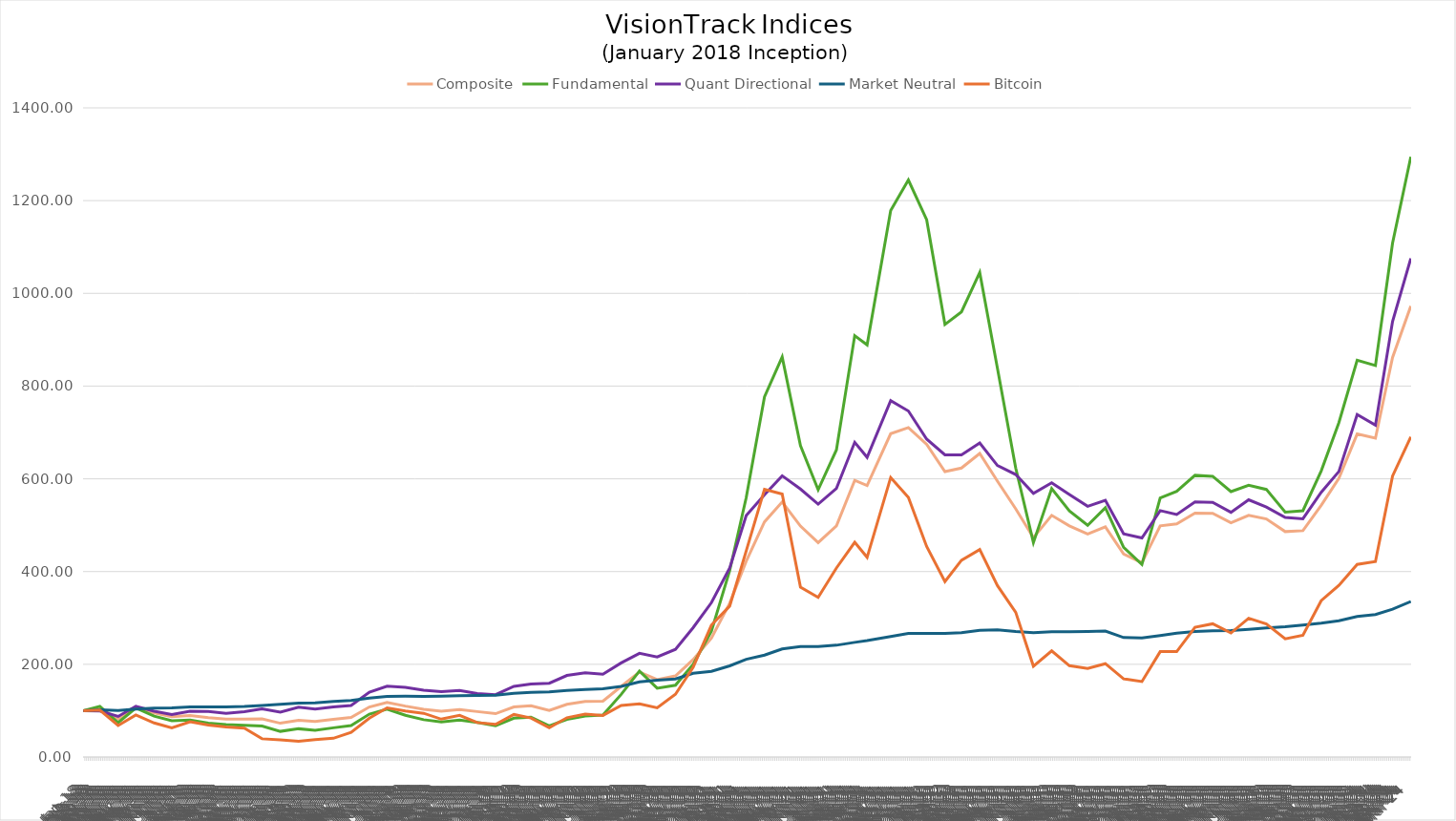
| Category | Composite | Fundamental | Quant Directional | Market Neutral | Bitcoin |
|---|---|---|---|---|---|
| 2018-01-31 | 100 | 100 | 100 | 100 | 100 |
| 2018-02-28 | 105.626 | 109.496 | 99.404 | 101.803 | 101.373 |
| 2018-03-31 | 81.785 | 74.086 | 87.509 | 100.609 | 68.018 |
| 2018-04-30 | 108.332 | 105.821 | 109.653 | 103.51 | 90.833 |
| 2018-05-31 | 95.101 | 88.265 | 98.96 | 105.404 | 73.54 |
| 2018-06-30 | 86.877 | 78.319 | 91.551 | 105.812 | 62.746 |
| 2018-07-31 | 89.714 | 79.552 | 98.729 | 107.935 | 75.884 |
| 2018-08-31 | 84.928 | 73.131 | 98.063 | 108.169 | 68.889 |
| 2018-09-30 | 81.868 | 70.118 | 94.287 | 108.338 | 64.897 |
| 2018-10-31 | 81.8 | 68.597 | 97.833 | 109.05 | 62.19 |
| 2018-11-30 | 82.432 | 66.686 | 104.114 | 111.09 | 39.351 |
| 2018-12-31 | 72.907 | 55.375 | 96.894 | 113.947 | 36.927 |
| 2019-01-31 | 79.299 | 60.976 | 107.526 | 116.381 | 33.875 |
| 2019-02-28 | 76.494 | 57.89 | 103.653 | 116.704 | 37.68 |
| 2019-03-31 | 81.369 | 63.058 | 108.098 | 120.095 | 40.523 |
| 2019-04-30 | 85.477 | 67.87 | 111.256 | 121.926 | 52.97 |
| 2019-05-31 | 107.968 | 92.481 | 139.715 | 127.266 | 83.986 |
| 2019-06-30 | 117.915 | 103.487 | 152.786 | 130.868 | 105.905 |
| 2019-07-31 | 109.882 | 90.025 | 150.275 | 131.131 | 99.144 |
| 2019-08-31 | 102.769 | 80.514 | 143.918 | 130.604 | 94.351 |
| 2019-09-30 | 99.038 | 75.442 | 140.925 | 131.029 | 81.736 |
| 2019-10-31 | 102.615 | 79.903 | 143.444 | 132.168 | 90.068 |
| 2019-11-30 | 98.039 | 74.56 | 136.908 | 132.583 | 74.384 |
| 2019-12-31 | 93.49 | 67.778 | 134.575 | 133.228 | 70.559 |
| 2020-01-31 | 107.88 | 83.694 | 152.355 | 137.246 | 91.805 |
| 2020-02-29 | 110.634 | 85.799 | 157.255 | 139.612 | 84.201 |
| 2020-03-31 | 100.46 | 67.318 | 159.138 | 140.321 | 63.311 |
| 2020-04-30 | 113.763 | 81.278 | 175.931 | 143.737 | 84.794 |
| 2020-05-31 | 119.719 | 88.282 | 181.543 | 145.74 | 92.809 |
| 2020-06-30 | 120.569 | 90.48 | 178.488 | 147.03 | 89.811 |
| 2020-07-31 | 152.349 | 135.081 | 202.984 | 152.312 | 111.404 |
| 2020-08-31 | 183.475 | 185.475 | 223.608 | 162.258 | 114.632 |
| 2020-09-30 | 166.948 | 148.379 | 215.724 | 165.512 | 106.046 |
| 2020-10-31 | 174.812 | 154.876 | 232.235 | 168.479 | 135.459 |
| 2020-11-30 | 210.301 | 199.886 | 278.975 | 180.48 | 193.596 |
| 2020-12-31 | 256.419 | 271.521 | 332.942 | 184.798 | 284.509 |
| 2021-01-31 | 331.688 | 402.01 | 407.897 | 196.62 | 325.528 |
| 2021-02-28 | 422.321 | 559.357 | 520.782 | 210.825 | 444.573 |
| 2021-03-31 | 507.198 | 776.967 | 565.735 | 219.723 | 577.556 |
| 2021-04-30 | 550.159 | 862.913 | 606.513 | 233.175 | 567.306 |
| 2021-05-31 | 498.139 | 671.423 | 577.943 | 238.202 | 366.283 |
| 2021-06-30 | 462.298 | 576.335 | 545.487 | 238.064 | 344.416 |
| 2021-07-31 | 498.716 | 662.515 | 579.426 | 241.157 | 407.672 |
| 2021-08-31 | 596.728 | 908.783 | 678.811 | 247.304 | 463.168 |
| 2021-09-21 | 585.701 | 888.903 | 646.364 | 251.267 | 430.668 |
| 2021-10-31 | 697.278 | 1178.732 | 768.512 | 259.993 | 602.874 |
| 2021-11-30 | 710.496 | 1244.552 | 746.225 | 266.382 | 559.939 |
| 2021-12-31 | 674.222 | 1158.831 | 685.584 | 266.489 | 454.089 |
| 2022-01-31 | 615.663 | 932.968 | 651.76 | 266.776 | 378.235 |
| 2022-02-28 | 623.224 | 959.978 | 651.537 | 268.127 | 424.448 |
| 2022-03-31 | 654.791 | 1045.128 | 677.186 | 273.41 | 447.491 |
| 2022-04-30 | 595.006 | 838.309 | 628.685 | 274.329 | 369.721 |
| 2022-05-31 | 535.234 | 623.345 | 609.216 | 270.496 | 312.212 |
| 2022-06-30 | 473.001 | 462.452 | 568.746 | 268.115 | 195.993 |
| 2022-07-31 | 521.237 | 578.957 | 591.379 | 270.183 | 229.091 |
| 2022-08-30 | 498.616 | 530.711 | 566.024 | 270.344 | 197.015 |
| 2022-09-30 | 480.978 | 499.844 | 540.69 | 270.6 | 191.071 |
| 2022-10-30 | 496.584 | 537.688 | 553.741 | 271.508 | 201.358 |
| 2022-11-30 | 438.032 | 451.972 | 481.282 | 257.704 | 168.691 |
| 2022-12-31 | 419.054 | 415.214 | 472.324 | 256.973 | 162.754 |
| 2023-01-31 | 498.566 | 558.67 | 531.49 | 262.005 | 227.274 |
| 2023-02-28 | 502.658 | 573.164 | 523.112 | 267.305 | 227.426 |
| 2023-03-31 | 526.063 | 607.568 | 550.062 | 270.686 | 279.718 |
| 2023-04-30 | 525.515 | 605.534 | 549.136 | 272.315 | 287.326 |
| 2023-05-31 | 505.075 | 572.419 | 527.801 | 272.881 | 267.472 |
| 2023-06-30 | 521.231 | 585.957 | 554.703 | 275.483 | 299.402 |
| 2023-07-30 | 513.532 | 577.162 | 539.189 | 278.6 | 287.216 |
| 2023-08-31 | 486.188 | 527.988 | 516.869 | 281.186 | 254.765 |
| 2023-09-30 | 488.18 | 531.23 | 513.927 | 284.668 | 262.714 |
| 2023-10-31 | 542.794 | 617.014 | 570.971 | 288.659 | 337.167 |
| 2023-11-30 | 600.863 | 721.214 | 615.856 | 293.821 | 370.311 |
| 2023-12-31 | 696.707 | 855.669 | 738.701 | 303.001 | 415.415 |
| 2024-01-31 | 687.616 | 844.305 | 715.687 | 307.316 | 421.646 |
| 2024-02-29 | 861.67 | 1108.105 | 939.081 | 318.936 | 606.074 |
| 2024-03-31 | 972.651 | 1294.616 | 1075.375 | 335.42 | 690.561 |